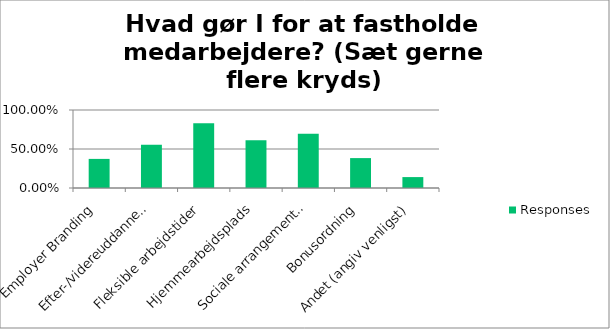
| Category | Responses |
|---|---|
| Employer Branding | 0.373 |
| Efter-/videreuddannelse | 0.554 |
| Fleksible arbejdstider | 0.829 |
| Hjemmearbejdsplads | 0.611 |
| Sociale arrangementer | 0.694 |
| Bonusordning | 0.383 |
| Andet (angiv venligst) | 0.14 |